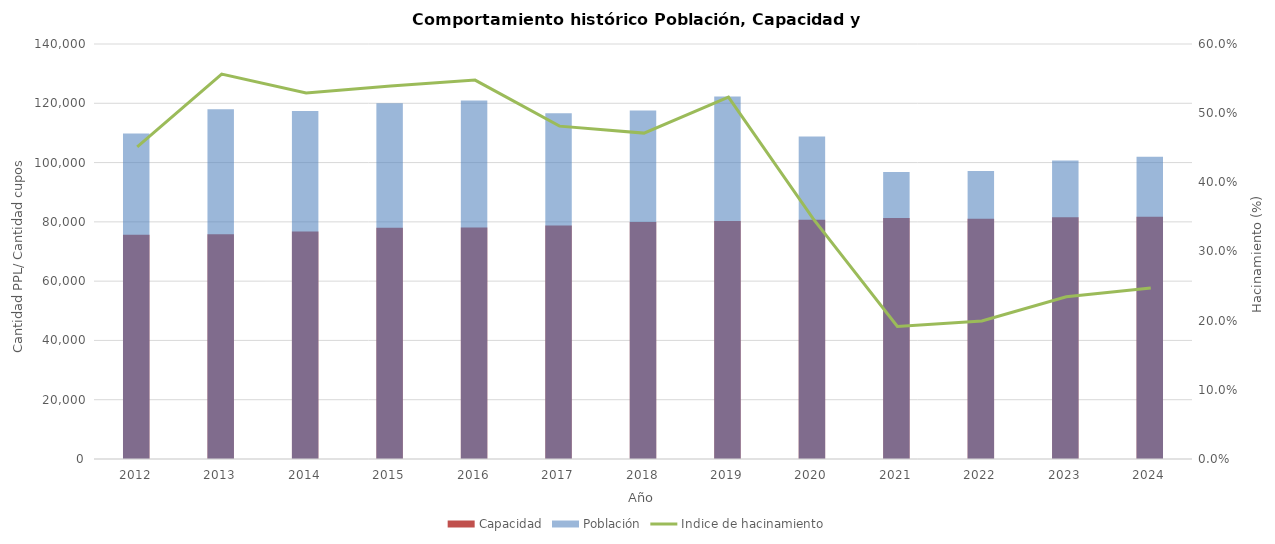
| Category | Capacidad | Población |
|---|---|---|
| 2012.0 | 75679.167 | 109822.083 |
| 2013.0 | 75796.583 | 117986.5 |
| 2014.0 | 76777 | 117389.083 |
| 2015.0 | 77979.75 | 120040.083 |
| 2016.0 | 78119.5 | 120914 |
| 2017.0 | 78759 | 116657.667 |
| 2018.0 | 79914 | 117569.583 |
| 2019.0 | 80296.167 | 122309.5 |
| 2020.0 | 80704.167 | 108777.75 |
| 2021.0 | 81268.833 | 96837.5 |
| 2022.0 | 81010.417 | 97175.917 |
| 2023.0 | 81594 | 100737.75 |
| 2024.0 | 81720 | 101934 |